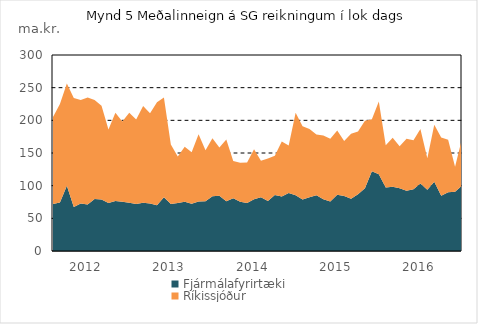
| Category | Fjármálafyrirtæki | Ríkissjóður |
|---|---|---|
|  | 72.003 | 133.152 |
|  | 74.144 | 150.84 |
|  | 99.798 | 156.501 |
|  | 67.452 | 166.914 |
|  | 72.564 | 158.701 |
| 2012 | 71.321 | 163.78 |
|  | 79.566 | 151.708 |
|  | 78.864 | 143.505 |
|  | 73.372 | 112.609 |
|  | 76.346 | 135.095 |
|  | 75.293 | 122.812 |
|  | 73.805 | 137.864 |
|  | 71.845 | 129.512 |
|  | 73.921 | 148.072 |
|  | 72.887 | 137.884 |
|  | 70.203 | 157.569 |
|  | 82.293 | 152.623 |
| 2013 | 72.036 | 90.926 |
|  | 73.496 | 71.069 |
|  | 75.574 | 84.018 |
|  | 72.512 | 78.5 |
|  | 75.624 | 103.199 |
|  | 76.041 | 78.122 |
|  | 83.754 | 88.766 |
|  | 84.739 | 73.489 |
|  | 76.079 | 94.744 |
|  | 80.719 | 56.922 |
|  | 75.267 | 59.897 |
|  | 73.465 | 61.849 |
| 2014 | 79.339 | 76.246 |
|  | 82.208 | 55.998 |
|  | 76.347 | 65.338 |
|  | 85.772 | 60.087 |
|  | 83.519 | 84.014 |
|  | 88.808 | 72.65 |
|  | 85.459 | 126.207 |
|  | 79.01 | 111.977 |
|  | 82.19 | 104.572 |
|  | 85.184 | 92.968 |
|  | 79.193 | 97.65 |
|  | 75.638 | 96.013 |
| 2015 | 85.952 | 98.37 |
|  | 84.367 | 83.972 |
|  | 79.904 | 99.621 |
|  | 86.856 | 95.932 |
|  | 96.048 | 103.471 |
|  | 122.197 | 79.335 |
|  | 117.509 | 111.367 |
|  | 97.326 | 64.379 |
|  | 98.464 | 74.842 |
|  | 96.04 | 64.255 |
|  | 92.157 | 79.821 |
|  | 94.486 | 75.121 |
| 2016 | 103.397 | 83.199 |